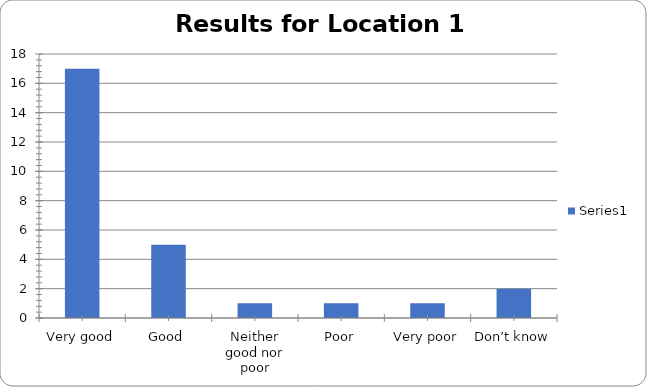
| Category | Series 0 |
|---|---|
| Very good | 17 |
| Good | 5 |
| Neither good nor poor | 1 |
| Poor | 1 |
| Very poor | 1 |
| Don’t know | 2 |